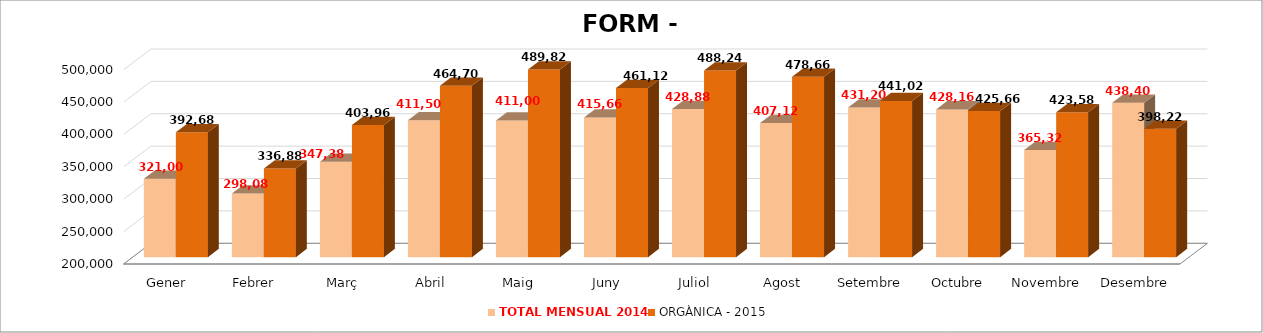
| Category | TOTAL MENSUAL 2014 | ORGÀNICA - 2015 |
|---|---|---|
| Gener | 320999.99 | 392680 |
| Febrer | 298080 | 336880 |
| Març | 347380 | 403960 |
| Abril | 411499.99 | 464700 |
| Maig | 411000 | 489820.01 |
| Juny | 415660 | 461120 |
| Juliol | 428880 | 488240 |
| Agost | 407120 | 478659.99 |
| Setembre | 431200 | 441020.02 |
| Octubre | 428160 | 425660 |
| Novembre | 365320 | 423580 |
| Desembre | 438399.99 | 398220.01 |